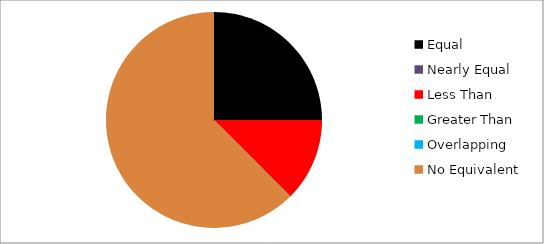
| Category | Series 0 |
|---|---|
| Equal | 2 |
| Nearly Equal | 0 |
| Less Than | 1 |
| Greater Than | 0 |
| Overlapping | 0 |
| No Equivalent | 5 |